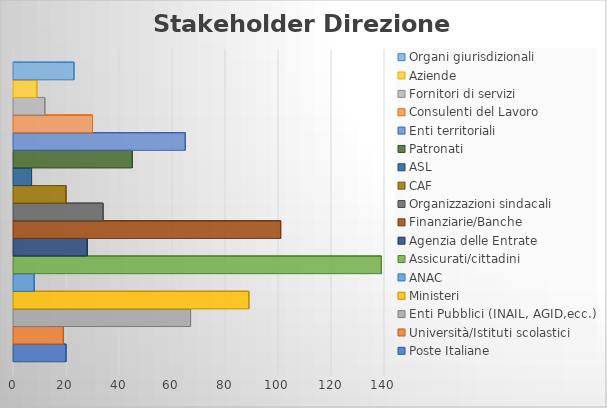
| Category | Poste Italiane | Università/Istituti scolastici | Enti Pubblici (INAIL, AGID,ecc.) | Ministeri | ANAC | Assicurati/cittadini | Agenzia delle Entrate | Finanziarie/Banche | Organizzazioni sindacali | CAF | ASL | Patronati | Enti territoriali | Consulenti del Lavoro | Fornitori di servizi | Aziende | Organi giurisdizionali |
|---|---|---|---|---|---|---|---|---|---|---|---|---|---|---|---|---|---|
| 0 | 20 | 19 | 67 | 89 | 8 | 139 | 28 | 101 | 34 | 20 | 7 | 45 | 65 | 30 | 12 | 9 | 23 |